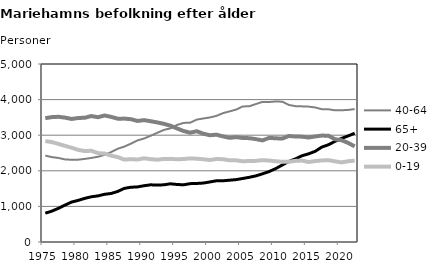
| Category | 40-64 | 65+ | 20-39 | 0-19 |
|---|---|---|---|---|
| 1975.0 | 2428 | 809 | 3478 | 2835 |
| 1976.0 | 2384 | 868 | 3508 | 2806 |
| 1977.0 | 2361 | 946 | 3517 | 2755 |
| 1978.0 | 2319 | 1037 | 3494 | 2700 |
| 1979.0 | 2311 | 1123 | 3456 | 2648 |
| 1980.0 | 2313 | 1169 | 3483 | 2588 |
| 1981.0 | 2334 | 1226 | 3491 | 2555 |
| 1982.0 | 2362 | 1271 | 3538 | 2562 |
| 1983.0 | 2394 | 1295 | 3505 | 2497 |
| 1984.0 | 2447 | 1340 | 3554 | 2483 |
| 1985.0 | 2525 | 1363 | 3515 | 2426 |
| 1986.0 | 2619 | 1420 | 3464 | 2385 |
| 1987.0 | 2679 | 1506 | 3466 | 2315 |
| 1988.0 | 2762 | 1538 | 3450 | 2327 |
| 1989.0 | 2853 | 1547 | 3400 | 2317 |
| 1990.0 | 2907 | 1581 | 3424 | 2351 |
| 1991.0 | 2984 | 1606 | 3393 | 2327 |
| 1992.0 | 3067 | 1600 | 3359 | 2312 |
| 1993.0 | 3147 | 1606 | 3320 | 2333 |
| 1994.0 | 3192 | 1635 | 3267 | 2335 |
| 1995.0 | 3288 | 1616 | 3191 | 2323 |
| 1996.0 | 3345 | 1606 | 3118 | 2330 |
| 1997.0 | 3351 | 1639 | 3070 | 2348 |
| 1998.0 | 3438 | 1644 | 3112 | 2340 |
| 1999.0 | 3470 | 1656 | 3042 | 2324 |
| 2000.0 | 3498 | 1687 | 2999 | 2304 |
| 2001.0 | 3544 | 1720 | 3014 | 2331 |
| 2002.0 | 3619 | 1720 | 2967 | 2326 |
| 2003.0 | 3670 | 1736 | 2926 | 2294 |
| 2004.0 | 3720 | 1753 | 2946 | 2293 |
| 2005.0 | 3808 | 1784 | 2921 | 2267 |
| 2006.0 | 3813 | 1818 | 2917 | 2276 |
| 2007.0 | 3876 | 1858 | 2889 | 2279 |
| 2008.0 | 3936 | 1915 | 2854 | 2300 |
| 2009.0 | 3932 | 1979 | 2925 | 2287 |
| 2010.0 | 3948 | 2062 | 2913 | 2267 |
| 2011.0 | 3941 | 2163 | 2906 | 2253 |
| 2012.0 | 3850 | 2263 | 2978 | 2255 |
| 2013.0 | 3816 | 2335 | 2963 | 2279 |
| 2014.0 | 3810 | 2423 | 2959 | 2288 |
| 2015.0 | 3803 | 2477 | 2935 | 2246 |
| 2016.0 | 3779 | 2548 | 2965 | 2273 |
| 2017.0 | 3731 | 2666 | 2989 | 2291 |
| 2018.0 | 3728 | 2731 | 2986 | 2298 |
| 2019.0 | 3699 | 2827 | 2887 | 2266 |
| 2020.0 | 3700 | 2910 | 2859 | 2236 |
| 2021.0 | 3710 | 2979 | 2784 | 2269 |
| 2022.0 | 3733 | 3055 | 2686 | 2283 |